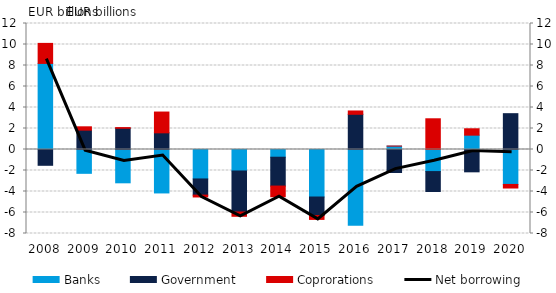
| Category | Banks | Government | Coprorations |
|---|---|---|---|
| 2008.0 | 8.199 | -1.505 | 1.907 |
| 2009.0 | -2.269 | 1.843 | 0.318 |
| 2010.0 | -3.173 | 2.021 | 0.066 |
| 2011.0 | -4.137 | 1.588 | 1.979 |
| 2012.0 | -2.805 | -1.54 | -0.177 |
| 2013.0 | -2.046 | -3.904 | -0.41 |
| 2014.0 | -0.735 | -2.748 | -1.014 |
| 2015.0 | -4.524 | -1.766 | -0.367 |
| 2016.0 | -7.217 | 3.354 | 0.315 |
| 2017.0 | 0.324 | -2.193 | 0.003 |
| 2018.0 | -2.102 | -1.896 | 2.925 |
| 2019.0 | 1.366 | -2.126 | 0.608 |
| 2020.0 | -3.327 | 3.412 | -0.342 |